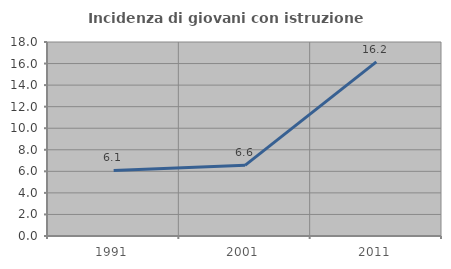
| Category | Incidenza di giovani con istruzione universitaria |
|---|---|
| 1991.0 | 6.087 |
| 2001.0 | 6.557 |
| 2011.0 | 16.162 |